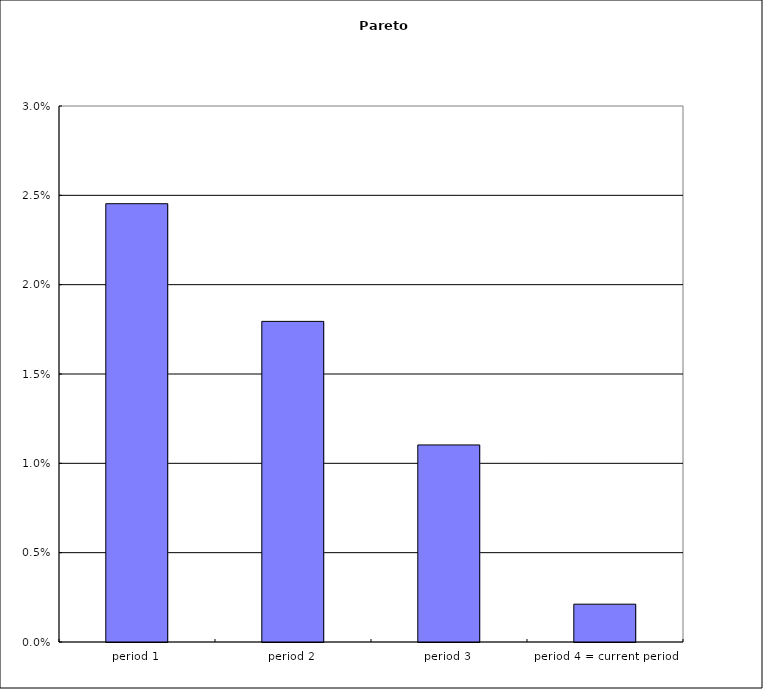
| Category | Outside Diameter |
|---|---|
| period 1 | 0.025 |
| period 2 | 0.018 |
| period 3 | 0.011 |
| period 4 = current period | 0.002 |